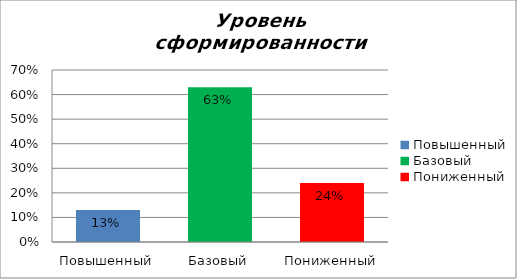
| Category | Уровень сформированности предметных результатов |
|---|---|
| Повышенный | 0.13 |
| Базовый | 0.63 |
| Пониженный | 0.24 |